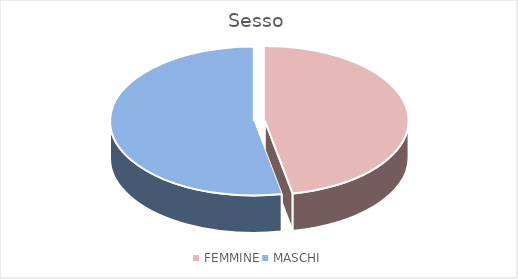
| Category | Series 0 |
|---|---|
| FEMMINE | 83 |
| MASCHI | 94 |